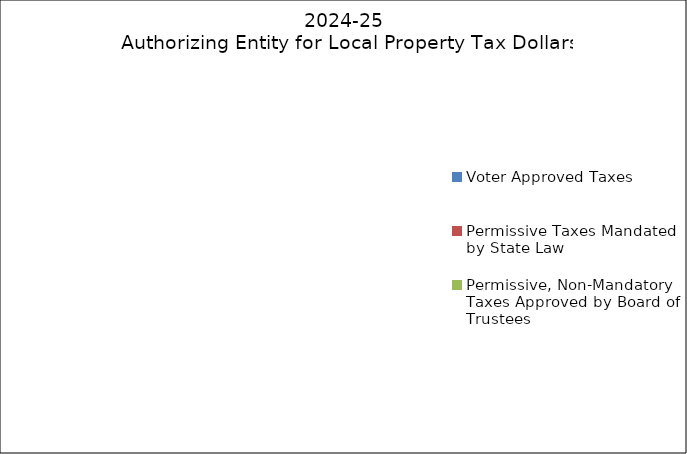
| Category | Total |
|---|---|
| Voter Approved Taxes | 0 |
| Permissive Taxes Mandated by State Law | 0 |
| Permissive, Non-Mandatory Taxes Approved by Board of Trustees | 0 |